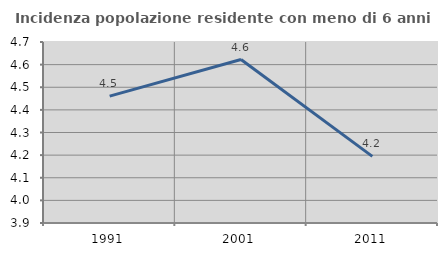
| Category | Incidenza popolazione residente con meno di 6 anni |
|---|---|
| 1991.0 | 4.461 |
| 2001.0 | 4.623 |
| 2011.0 | 4.195 |